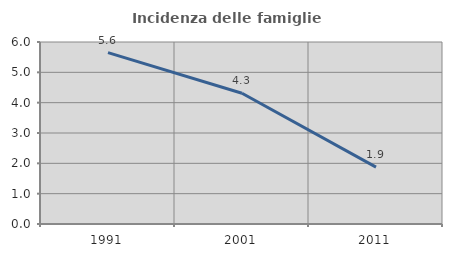
| Category | Incidenza delle famiglie numerose |
|---|---|
| 1991.0 | 5.65 |
| 2001.0 | 4.31 |
| 2011.0 | 1.877 |